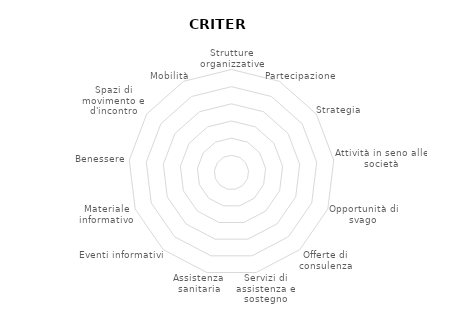
| Category | Kriterien |
|---|---|
| Strutture organizzative
 | 0 |
| Partecipazione | 0 |
| Strategia | 0 |
| Attività in seno alle società | 0 |
| Opportunità di svago | 0 |
| Offerte di consulenza | 0 |
| Servizi di assistenza e sostegno | 0 |
| Assistenza sanitaria | 0 |
| Eventi informativi | 0 |
| Materiale informativo | 0 |
| Benessere



 | 0 |
| Spazi di movimento e d'incontro | 0 |
| Mobilità | 0 |